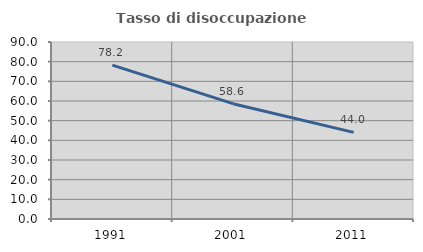
| Category | Tasso di disoccupazione giovanile  |
|---|---|
| 1991.0 | 78.208 |
| 2001.0 | 58.636 |
| 2011.0 | 44.048 |